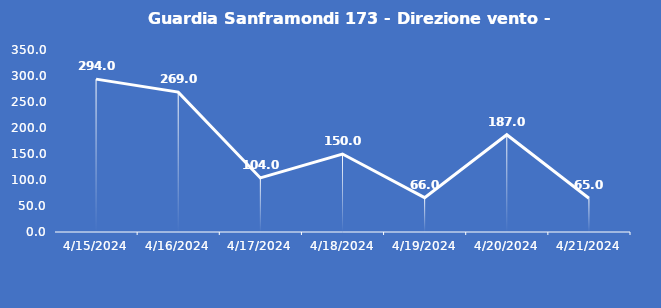
| Category | Guardia Sanframondi 173 - Direzione vento - Grezzo (°N) |
|---|---|
| 4/15/24 | 294 |
| 4/16/24 | 269 |
| 4/17/24 | 104 |
| 4/18/24 | 150 |
| 4/19/24 | 66 |
| 4/20/24 | 187 |
| 4/21/24 | 65 |